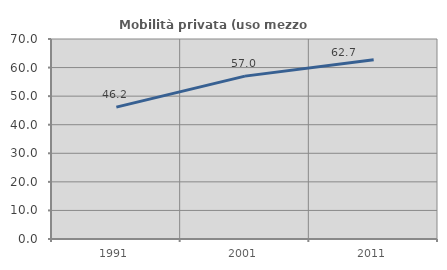
| Category | Mobilità privata (uso mezzo privato) |
|---|---|
| 1991.0 | 46.154 |
| 2001.0 | 57.009 |
| 2011.0 | 62.736 |